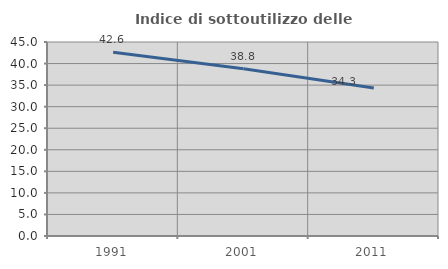
| Category | Indice di sottoutilizzo delle abitazioni  |
|---|---|
| 1991.0 | 42.647 |
| 2001.0 | 38.806 |
| 2011.0 | 34.307 |